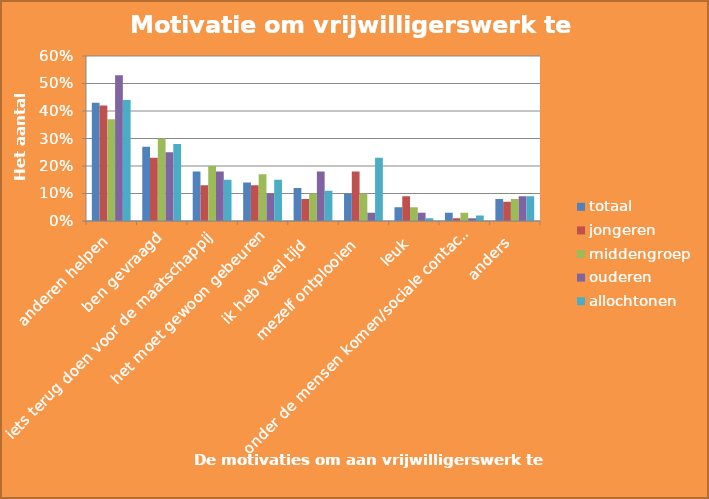
| Category | totaal | jongeren | middengroep | ouderen | allochtonen |
|---|---|---|---|---|---|
| anderen helpen | 0.43 | 0.42 | 0.37 | 0.53 | 0.44 |
| ben gevraagd | 0.27 | 0.23 | 0.3 | 0.25 | 0.28 |
| iets terug doen voor de maatschappij | 0.18 | 0.13 | 0.2 | 0.18 | 0.15 |
| het moet gewoon gebeuren | 0.14 | 0.13 | 0.17 | 0.1 | 0.15 |
| ik heb veel tijd  | 0.12 | 0.08 | 0.1 | 0.18 | 0.11 |
| mezelf ontplooien  | 0.1 | 0.18 | 0.1 | 0.03 | 0.23 |
| leuk | 0.05 | 0.09 | 0.05 | 0.03 | 0.01 |
| onder de mensen komen/sociale contacten | 0.03 | 0.01 | 0.03 | 0.01 | 0.02 |
| anders | 0.08 | 0.07 | 0.08 | 0.09 | 0.09 |